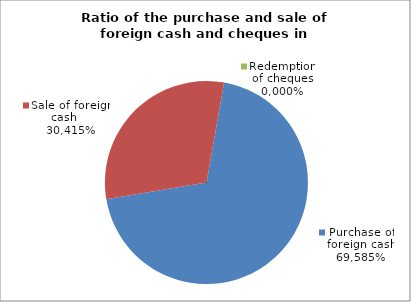
| Category | Purchase of foreign cash |
|---|---|
| 0 | 0.696 |
| 1 | 0.304 |
| 2 | 0 |